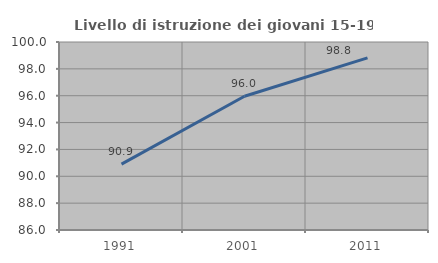
| Category | Livello di istruzione dei giovani 15-19 anni |
|---|---|
| 1991.0 | 90.909 |
| 2001.0 | 95.96 |
| 2011.0 | 98.817 |